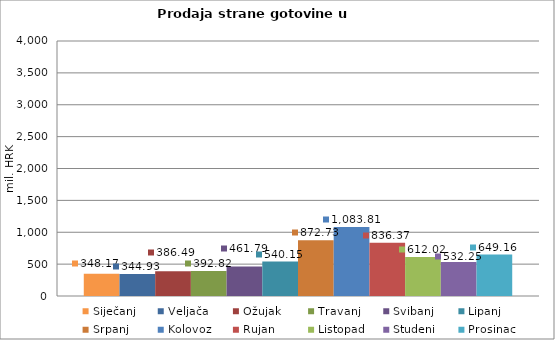
| Category | Siječanj | Veljača | Ožujak | Travanj | Svibanj | Lipanj | Srpanj | Kolovoz | Rujan | Listopad | Studeni | Prosinac |
|---|---|---|---|---|---|---|---|---|---|---|---|---|
| 0 | 348.171 | 344.929 | 386.485 | 392.82 | 461.788 | 540.146 | 872.732 | 1083.812 | 836.371 | 612.024 | 532.25 | 649.164 |